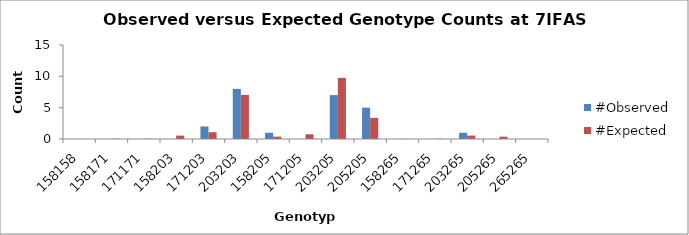
| Category | #Observed | #Expected |
|---|---|---|
| 158158.0 | 0 | 0.01 |
| 158171.0 | 0 | 0.042 |
| 171171.0 | 0 | 0.042 |
| 158203.0 | 0 | 0.542 |
| 171203.0 | 2 | 1.083 |
| 203203.0 | 8 | 7.042 |
| 158205.0 | 1 | 0.375 |
| 171205.0 | 0 | 0.75 |
| 203205.0 | 7 | 9.75 |
| 205205.0 | 5 | 3.375 |
| 158265.0 | 0 | 0.021 |
| 171265.0 | 0 | 0.042 |
| 203265.0 | 1 | 0.542 |
| 205265.0 | 0 | 0.375 |
| 265265.0 | 0 | 0.01 |